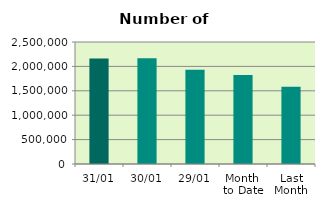
| Category | Series 0 |
|---|---|
| 31/01 | 2160812 |
| 30/01 | 2167794 |
| 29/01 | 1931846 |
| Month 
to Date | 1821445.364 |
| Last
Month | 1583843.3 |